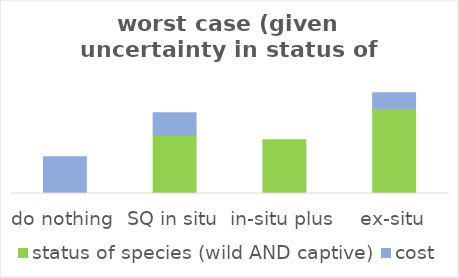
| Category | status of species (wild AND captive) | cost |
|---|---|---|
| do nothing | 0 | 0.091 |
| SQ in situ | 0.144 | 0.056 |
| in-situ plus | 0.134 | 0 |
| ex-situ | 0.212 | 0.038 |